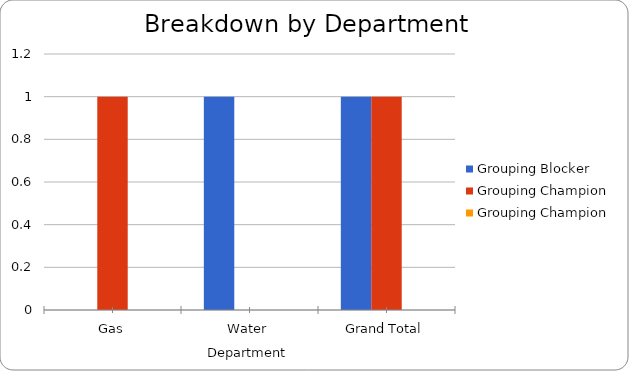
| Category | Grouping |
|---|---|
| Gas |  |
| Water |  |
| Grand Total |  |